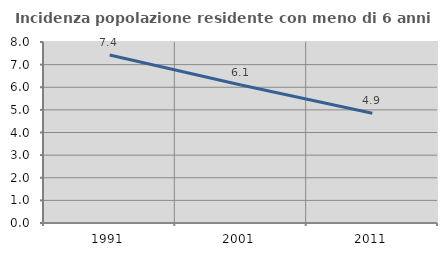
| Category | Incidenza popolazione residente con meno di 6 anni |
|---|---|
| 1991.0 | 7.423 |
| 2001.0 | 6.098 |
| 2011.0 | 4.855 |